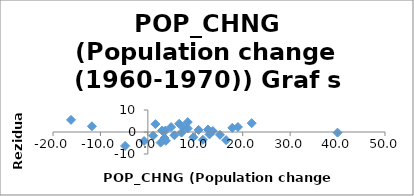
| Category | Series 0 |
|---|---|
| 13.7 | 0.432 |
| -0.8 | -4.092 |
| 9.6 | -2.364 |
| 40.0 | -0.295 |
| 8.41 | 4.51 |
| 3.5 | -2.739 |
| 3.0 | 0.633 |
| 7.1 | -0.289 |
| 13.0 | -1.084 |
| 10.7 | 0.945 |
| -16.2 | 5.511 |
| 6.6 | 3.757 |
| 21.9 | 4.013 |
| 17.8 | 1.871 |
| -11.8 | 2.605 |
| 7.5 | 1.996 |
| 3.7 | 0.655 |
| 1.6 | 3.566 |
| 8.4 | 1.606 |
| 2.7 | -4.817 |
| 5.6 | -1.481 |
| 12.7 | 1.121 |
| -4.8 | -6.326 |
| 16.5 | -3.697 |
| 15.2 | -1.285 |
| 11.6 | -3.569 |
| 4.9 | 2.231 |
| 1.1 | -1.69 |
| 3.8 | -4.005 |
| 19.0 | 2.279 |